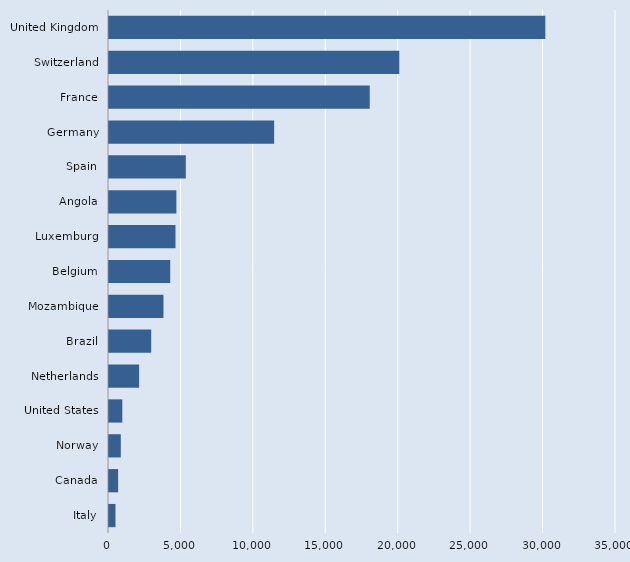
| Category | Series 0 |
|---|---|
| Italy | 446 |
| Canada | 629 |
| Norway | 815 |
| United States | 918 |
| Netherlands | 2079 |
| Brazil | 2913 |
| Mozambique | 3759 |
| Belgium | 4227 |
| Luxemburg | 4590 |
| Angola | 4651 |
| Spain | 5302 |
| Germany | 11401 |
| France | 18000 |
| Switzerland | 20039 |
| United Kingdom | 30121 |